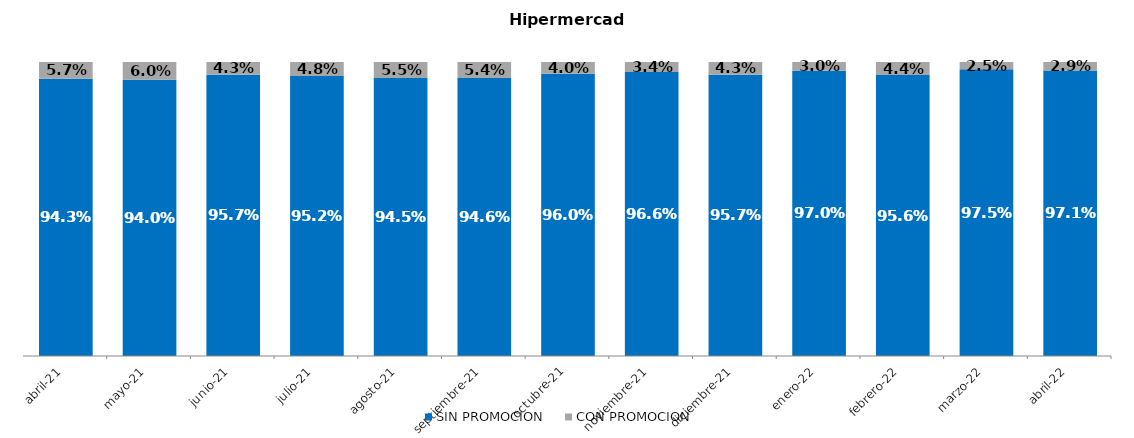
| Category | SIN PROMOCION   | CON PROMOCION   |
|---|---|---|
| 2021-04-01 | 0.943 | 0.057 |
| 2021-05-01 | 0.94 | 0.06 |
| 2021-06-01 | 0.957 | 0.043 |
| 2021-07-01 | 0.952 | 0.048 |
| 2021-08-01 | 0.945 | 0.055 |
| 2021-09-01 | 0.946 | 0.054 |
| 2021-10-01 | 0.96 | 0.04 |
| 2021-11-01 | 0.966 | 0.034 |
| 2021-12-01 | 0.957 | 0.043 |
| 2022-01-01 | 0.97 | 0.03 |
| 2022-02-01 | 0.956 | 0.044 |
| 2022-03-01 | 0.975 | 0.025 |
| 2022-04-01 | 0.971 | 0.029 |